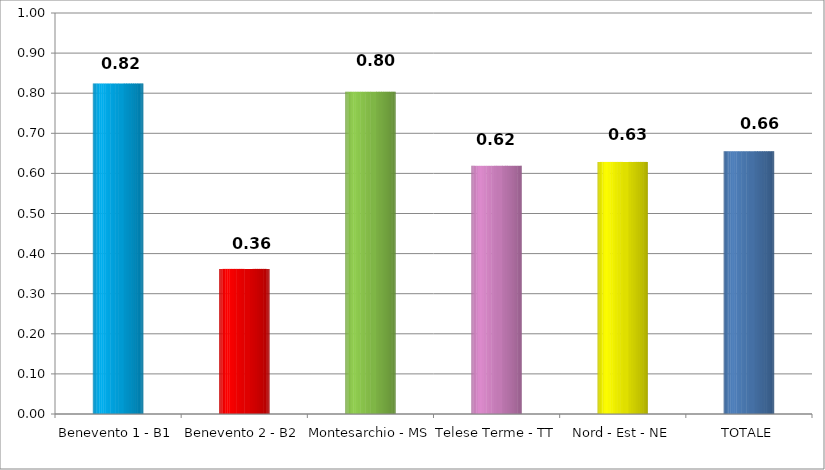
| Category | Series 0 |
|---|---|
| Benevento 1 - B1 | 0.824 |
| Benevento 2 - B2 | 0.362 |
| Montesarchio - MS | 0.804 |
| Telese Terme - TT | 0.619 |
| Nord - Est - NE | 0.629 |
| TOTALE | 0.655 |